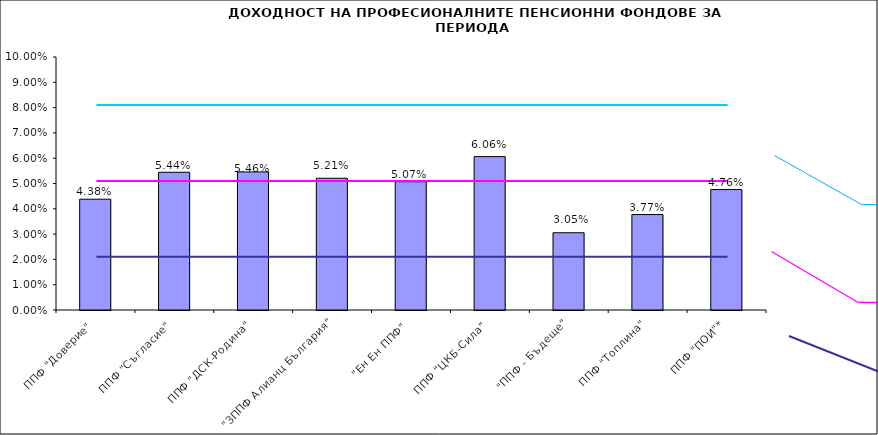
| Category | Series 0 |
|---|---|
| ППФ "Доверие"  | 0.044 |
| ППФ "Съгласие"  | 0.054 |
| ППФ "ДСК-Родина"  | 0.055 |
| "ЗППФ Алианц България"  | 0.052 |
| "Ен Ен ППФ"  | 0.051 |
| ППФ "ЦКБ-Сила"  | 0.061 |
| "ППФ - Бъдеще" | 0.031 |
| ППФ "Топлина" | 0.038 |
| ППФ "ПОИ"* | 0.048 |